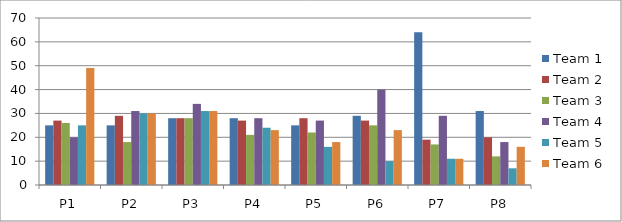
| Category | Team 1 | Team 2 | Team 3 | Team 4 | Team 5 | Team 6 |
|---|---|---|---|---|---|---|
| P1 | 25 | 27 | 26 | 20 | 25 | 49 |
| P2 | 25 | 29 | 18 | 31 | 30 | 30 |
| P3 | 28 | 28 | 28 | 34 | 31 | 31 |
| P4 | 28 | 27 | 21 | 28 | 24 | 23 |
| P5 | 25 | 28 | 22 | 27 | 16 | 18 |
| P6 | 29 | 27 | 25 | 40 | 10 | 23 |
| P7 | 64 | 19 | 17 | 29 | 11 | 11 |
| P8 | 31 | 20 | 12 | 18 | 7 | 16 |